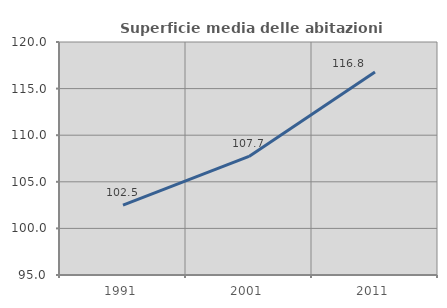
| Category | Superficie media delle abitazioni occupate |
|---|---|
| 1991.0 | 102.49 |
| 2001.0 | 107.719 |
| 2011.0 | 116.787 |